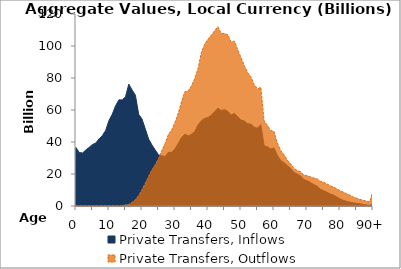
| Category | Private Transfers, Inflows | Private Transfers, Outflows |
|---|---|---|
| 0 | 36451.039 | 0 |
|  | 33412.973 | 0 |
| 2 | 33154.394 | 0 |
| 3 | 35061.608 | 0 |
| 4 | 36668.348 | 0 |
| 5 | 38427.137 | 0 |
| 6 | 39378.187 | 0 |
| 7 | 41990.957 | 0 |
| 8 | 44060.367 | 0 |
| 9 | 47277.034 | 0 |
| 10 | 53507.016 | 0 |
| 11 | 57397.814 | 0 |
| 12 | 62674.616 | 0 |
| 13 | 66345.299 | 0 |
| 14 | 66297.795 | 0 |
| 15 | 68238.17 | 748.174 |
| 16 | 76176.216 | 963.772 |
| 17 | 72504.416 | 2287.872 |
| 18 | 69239.736 | 4014.45 |
| 19 | 57306.811 | 6549.904 |
| 20 | 54352.554 | 10223.597 |
| 21 | 48184.396 | 14203.183 |
| 22 | 41873.639 | 18486.367 |
| 23 | 38181.341 | 22571.742 |
| 24 | 35055.047 | 25725.389 |
| 25 | 31946.026 | 29626.67 |
| 26 | 31329.682 | 34764.677 |
| 27 | 30924.629 | 39069.886 |
| 28 | 33550.998 | 44682.646 |
| 29 | 33562.239 | 47572.525 |
| 30 | 35813.022 | 52214.698 |
| 31 | 39176.55 | 58019.284 |
| 32 | 42798.963 | 65345.311 |
| 33 | 44898.227 | 71513.39 |
| 34 | 43803.187 | 71922.327 |
| 35 | 44844.747 | 75113.774 |
| 36 | 46553.256 | 79696.973 |
| 37 | 50748.992 | 85998.127 |
| 38 | 53308.515 | 96020.46 |
| 39 | 54756.816 | 101131.054 |
| 40 | 55298.323 | 104283.194 |
| 41 | 56813.216 | 106732.058 |
| 42 | 58846.358 | 109561.293 |
| 43 | 61113.948 | 111991.969 |
| 44 | 59708.933 | 107846.011 |
| 45 | 60266.133 | 107846.274 |
| 46 | 59159.884 | 106991.138 |
| 47 | 56860.751 | 102440.1 |
| 48 | 57856.173 | 103118.704 |
| 49 | 55830.416 | 97694.723 |
| 50 | 53632.22 | 92840.988 |
| 51 | 53143.586 | 87662.518 |
| 52 | 51424.087 | 83427.359 |
| 53 | 51135.333 | 80815.804 |
| 54 | 49233.266 | 75861.148 |
| 55 | 48664.851 | 73147.517 |
| 56 | 50809.592 | 74252.51 |
| 57 | 37638.413 | 53164.612 |
| 58 | 37008.241 | 50469.655 |
| 59 | 35625.173 | 47180.841 |
| 60 | 36286.16 | 46562.9 |
| 61 | 31665.697 | 39435.448 |
| 62 | 28543.283 | 34771.764 |
| 63 | 27156.437 | 32141.872 |
| 64 | 25258.353 | 28784.669 |
| 65 | 23582.372 | 26538.605 |
| 66 | 21089.366 | 23524.977 |
| 67 | 19981.557 | 22203.282 |
| 68 | 18956.876 | 21578.525 |
| 69 | 16601.248 | 19384.824 |
| 70 | 15802.855 | 18903.292 |
| 71 | 14744.239 | 18259.918 |
| 72 | 13464.776 | 17518.86 |
| 73 | 12418.91 | 17064.834 |
| 74 | 10535.77 | 15487.181 |
| 75 | 9621.886 | 14895.618 |
| 76 | 8637.944 | 13846.604 |
| 77 | 7578.387 | 12639.789 |
| 78 | 6839.04 | 11879.973 |
| 79 | 5707.218 | 10749.447 |
| 80 | 4453.053 | 9556.984 |
| 81 | 3528.228 | 8691.584 |
| 82 | 2889.618 | 7737.281 |
| 83 | 2393.882 | 6826.55 |
| 84 | 1914.946 | 5529.011 |
| 85 | 1762.042 | 4988.479 |
| 86 | 1389.328 | 4152.987 |
| 87 | 984.906 | 3573.728 |
| 88 | 659.794 | 3095.104 |
| 89 | 403.384 | 2570.372 |
| 90+ | 1251.224 | 9479.256 |